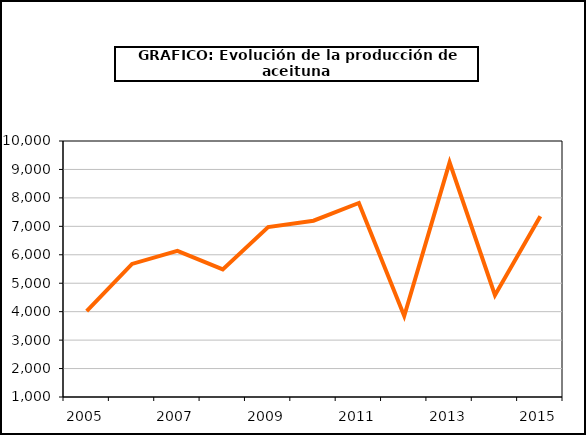
| Category | Series 0 |
|---|---|
| 2005.0 | 4021.72 |
| 2006.0 | 5679.021 |
| 2007.0 | 6140.251 |
| 2008.0 | 5485.374 |
| 2009.0 | 6972.094 |
| 2010.0 | 7197.6 |
| 2011.0 | 7820.06 |
| 2012.0 | 3849.263 |
| 2013.0 | 9250.61 |
| 2014.0 | 4579.208 |
| 2015.0 | 7352.095 |